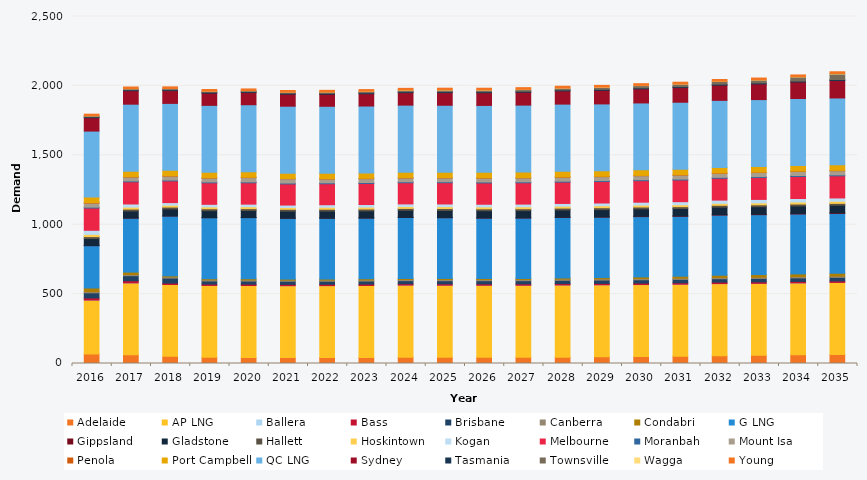
| Category | Adelaide | AP LNG | Ballera | Bass | Brisbane | Canberra | Condabri | G LNG | Gippsland | Gladstone | Hallett | Hoskintown | Kogan | Melbourne | Moranbah | Mount Isa | Penola | Port Campbell | QC LNG | Sydney | Tasmania | Townsville | Wagga | Young |
|---|---|---|---|---|---|---|---|---|---|---|---|---|---|---|---|---|---|---|---|---|---|---|---|---|
| 2016.0 | 68.122 | 388.69 | 0.011 | 15.538 | 36.808 | 8.587 | 26.133 | 305.178 | 0.65 | 50.539 | 13.868 | 16.339 | 29.207 | 160.332 | 6.43 | 29.515 | 2.752 | 41.648 | 474.034 | 96.351 | 6.693 | 6.647 | 0.313 | 12.073 |
| 2017.0 | 62.727 | 517.774 | 0.029 | 15.524 | 36.367 | 8.631 | 17.363 | 389.235 | 0.66 | 50.094 | 13.857 | 14.273 | 22.808 | 159.511 | 6.358 | 28.261 | 2.659 | 39.64 | 482.502 | 97.093 | 6.786 | 7.369 | 0.377 | 12.117 |
| 2018.0 | 51.435 | 517.774 | 0.063 | 10.003 | 36.066 | 8.622 | 7.324 | 431.486 | 0.644 | 49.687 | 13.87 | 13.65 | 18.508 | 156.408 | 6.291 | 28.131 | 2.652 | 38.889 | 482.502 | 92.045 | 6.786 | 7.832 | 0.381 | 12.111 |
| 2019.0 | 44.479 | 517.774 | 0.027 | 9.952 | 22.081 | 8.578 | 7.391 | 440.174 | 0.539 | 50.219 | 13.685 | 13.406 | 18.479 | 154.866 | 6.25 | 28.083 | 2.504 | 38.844 | 482.502 | 87.878 | 6.844 | 7.112 | 0.274 | 12.081 |
| 2020.0 | 42.488 | 519.159 | 0.024 | 9.959 | 22.096 | 8.487 | 7.506 | 441.353 | 0.562 | 50.369 | 13.606 | 14.065 | 18.472 | 153.799 | 6.419 | 30.893 | 2.46 | 38.883 | 483.793 | 87.61 | 6.895 | 6.907 | 0.27 | 12.025 |
| 2021.0 | 42.551 | 517.792 | 0.035 | 9.903 | 22.023 | 8.375 | 7.165 | 438.63 | 0.507 | 50.429 | 13.56 | 13.097 | 17.39 | 152.172 | 6.569 | 30.387 | 2.448 | 38.245 | 482.474 | 86.84 | 6.939 | 7.263 | 0.181 | 11.935 |
| 2022.0 | 43.07 | 517.822 | 0.043 | 9.821 | 21.843 | 8.319 | 7.387 | 438.63 | 0.643 | 50.262 | 13.468 | 14.341 | 18.289 | 151.009 | 6.68 | 27.517 | 2.432 | 39.214 | 482.43 | 86.76 | 6.977 | 8.643 | 0.471 | 11.865 |
| 2023.0 | 44.097 | 517.851 | 0.055 | 9.876 | 22.019 | 8.347 | 7.521 | 438.279 | 0.795 | 50.487 | 13.535 | 13.936 | 18.785 | 151.617 | 6.694 | 27.672 | 2.469 | 38.657 | 482.386 | 88.551 | 7.01 | 9.702 | 1.261 | 11.906 |
| 2024.0 | 45.237 | 519.267 | 0.075 | 9.962 | 22.299 | 8.428 | 7.237 | 439.452 | 0.97 | 50.759 | 13.618 | 13.988 | 18.52 | 152.534 | 6.715 | 27.367 | 2.498 | 38.885 | 483.633 | 89.96 | 7.038 | 10.246 | 1.683 | 11.999 |
| 2025.0 | 45.834 | 517.911 | 0.077 | 10.053 | 22.586 | 8.506 | 7.663 | 437.571 | 1.233 | 51.049 | 13.739 | 13.867 | 19.343 | 153.225 | 6.737 | 27.579 | 2.502 | 38.756 | 482.298 | 91.098 | 7.061 | 10.788 | 1.971 | 12.087 |
| 2026.0 | 45.379 | 517.94 | 0.08 | 10.122 | 22.856 | 8.584 | 7.425 | 435.47 | 1.325 | 51.305 | 13.726 | 13.931 | 19.32 | 153.479 | 6.756 | 27.768 | 2.537 | 39.064 | 482.255 | 91.704 | 7.079 | 11.099 | 1.943 | 12.173 |
| 2027.0 | 45.398 | 517.97 | 0.085 | 10.186 | 23.144 | 8.658 | 7.51 | 435.47 | 1.241 | 51.578 | 13.716 | 14.162 | 19.356 | 153.584 | 6.778 | 27.984 | 2.533 | 40.131 | 482.211 | 92.776 | 7.092 | 11.814 | 1.729 | 12.256 |
| 2028.0 | 45.913 | 519.385 | 0.08 | 10.259 | 23.435 | 8.735 | 7.97 | 436.636 | 1.568 | 51.879 | 13.683 | 13.973 | 19.533 | 153.79 | 6.801 | 28.196 | 2.522 | 41.02 | 483.457 | 95.07 | 7.1 | 12.779 | 1.417 | 12.343 |
| 2029.0 | 48.643 | 518.029 | 0.117 | 10.339 | 23.733 | 8.82 | 9.247 | 435.47 | 2.083 | 52.174 | 13.693 | 14.29 | 19.702 | 154.562 | 6.826 | 28.398 | 2.537 | 39.442 | 482.123 | 97.823 | 7.106 | 14.616 | 1.66 | 12.435 |
| 2030.0 | 50.574 | 518.058 | 0.156 | 10.432 | 24.038 | 8.911 | 11.535 | 434.501 | 3.091 | 52.5 | 13.704 | 13.83 | 20.81 | 155.06 | 6.852 | 28.608 | 2.458 | 40.037 | 482.079 | 101.456 | 7.109 | 16.369 | 1.417 | 12.533 |
| 2031.0 | 52.727 | 518.088 | 0.196 | 10.527 | 24.344 | 9.004 | 13.773 | 431.623 | 3.208 | 52.823 | 13.689 | 13.984 | 21.9 | 155.932 | 6.878 | 28.82 | 2.427 | 40.34 | 482.035 | 105.434 | 7.111 | 17.834 | 1.351 | 12.632 |
| 2032.0 | 55.824 | 519.504 | 0.239 | 10.614 | 24.655 | 9.096 | 16.312 | 432.778 | 3.901 | 53.139 | 13.769 | 14.024 | 23.37 | 157.117 | 6.905 | 29.036 | 2.452 | 39.778 | 483.281 | 109.476 | 7.113 | 19.412 | 1.422 | 12.731 |
| 2033.0 | 58.676 | 518.147 | 0.286 | 10.697 | 24.967 | 9.187 | 18.78 | 431.623 | 3.677 | 53.467 | 13.74 | 14.101 | 24.79 | 157.62 | 6.933 | 29.254 | 2.441 | 41.038 | 481.947 | 112.735 | 7.114 | 20.906 | 1.618 | 12.827 |
| 2034.0 | 62.2 | 518.177 | 0.272 | 10.786 | 25.288 | 9.279 | 19.422 | 431.623 | 4.421 | 53.81 | 13.767 | 14.292 | 25.353 | 158.766 | 6.977 | 29.484 | 2.46 | 40.729 | 481.903 | 118.961 | 7.114 | 29.117 | 1.847 | 12.927 |
| 2035.0 | 65.552 | 518.206 | 0.217 | 10.873 | 25.611 | 9.372 | 19.621 | 431.623 | 4.611 | 54.175 | 13.777 | 15.469 | 23.606 | 159.37 | 7.023 | 29.715 | 2.449 | 40.332 | 481.453 | 125.588 | 7.113 | 39.742 | 3.262 | 13.026 |